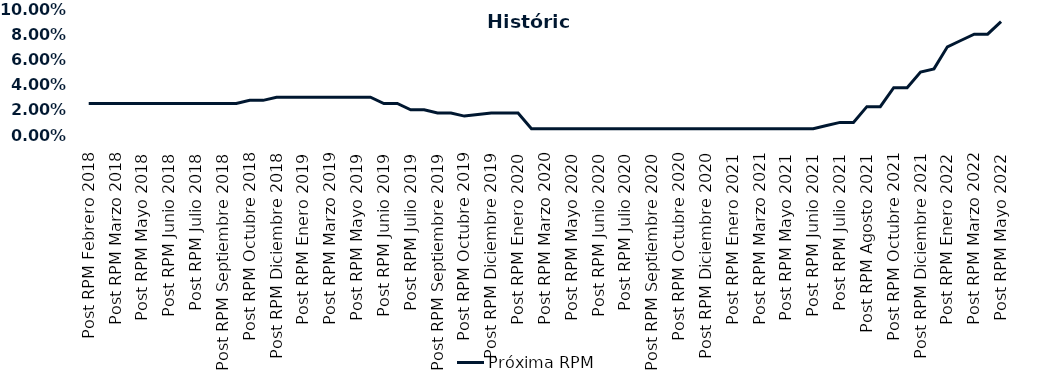
| Category | Próxima RPM |
|---|---|
| Post RPM Febrero 2018 | 0.025 |
| Pre RPM Marzo 2018 | 0.025 |
| Post RPM Marzo 2018 | 0.025 |
| Pre RPM Mayo 2018 | 0.025 |
| Post RPM Mayo 2018 | 0.025 |
| Pre RPM Junio 2018 | 0.025 |
| Post RPM Junio 2018 | 0.025 |
| Pre RPM Julio 2018 | 0.025 |
| Post RPM Julio 2018 | 0.025 |
| Pre RPM Septiembre 2018 | 0.025 |
| Post RPM Septiembre 2018 | 0.025 |
| Pre RPM Octubre 2018 | 0.025 |
| Post RPM Octubre 2018 | 0.028 |
| Pre RPM Diciembre 2018 | 0.028 |
| Post RPM Diciembre 2018 | 0.03 |
| Pre RPM Enero 2019 | 0.03 |
| Post RPM Enero 2019 | 0.03 |
| Pre RPM Marzo 2019 | 0.03 |
| Post RPM Marzo 2019 | 0.03 |
| Pre RPM Mayo 2019 | 0.03 |
| Post RPM Mayo 2019 | 0.03 |
| Pre RPM Junio 2019 | 0.03 |
| Post RPM Junio 2019 | 0.025 |
| Pre RPM Julio 2019 | 0.025 |
| Post RPM Julio 2019 | 0.02 |
| Pre RPM Septiembre 2019 | 0.02 |
| Post RPM Septiembre 2019 | 0.018 |
| Pre RPM Octubre 2019 | 0.018 |
| Post RPM Octubre 2019 | 0.015 |
| Pre RPM Diciembre 2019 | 0.016 |
| Post RPM Diciembre 2019 | 0.018 |
| Pre RPM Enero 2020 | 0.018 |
| Post RPM Enero 2020 | 0.018 |
| Pre RPM Marzo 2020 | 0.005 |
| Post RPM Marzo 2020 | 0.005 |
| Pre RPM Mayo 2020 | 0.005 |
| Post RPM Mayo 2020 | 0.005 |
| Pre RPM Junio 2020 | 0.005 |
| Post RPM Junio 2020 | 0.005 |
| Pre RPM Julio 2020 | 0.005 |
| Post RPM Julio 2020 | 0.005 |
| Pre RPM Septiembre 2020 | 0.005 |
| Post RPM Septiembre 2020 | 0.005 |
| Pre RPM Octubre 2020 | 0.005 |
| Post RPM Octubre 2020 | 0.005 |
| Pre RPM Diciembre 2020 | 0.005 |
| Post RPM Diciembre 2020 | 0.005 |
| Pre RPM Enero 2021 | 0.005 |
| Post RPM Enero 2021 | 0.005 |
| Pre RPM Marzo 2021 | 0.005 |
| Post RPM Marzo 2021 | 0.005 |
| Pre RPM Mayo 2021 | 0.005 |
| Post RPM Mayo 2021 | 0.005 |
| Pre RPM Junio 2021 | 0.005 |
| Post RPM Junio 2021 | 0.005 |
| Pre RPM Julio 2021 | 0.008 |
| Post RPM Julio 2021 | 0.01 |
| Pre RPM Agosto 2021 | 0.01 |
| Post RPM Agosto 2021 | 0.022 |
| Pre RPM Octubre 2021 | 0.022 |
| Post RPM Octubre 2021 | 0.038 |
| Pre RPM Diciembre 2021 | 0.038 |
| Post RPM Diciembre 2021 | 0.05 |
| Pre RPM Enero 2022 | 0.052 |
| Post RPM Enero 2022 | 0.07 |
| Pre RPM Marzo 2022 | 0.075 |
| Post RPM Marzo 2022 | 0.08 |
| Pre RPM Mayo 2022 | 0.08 |
| Post RPM Mayo 2022 | 0.09 |